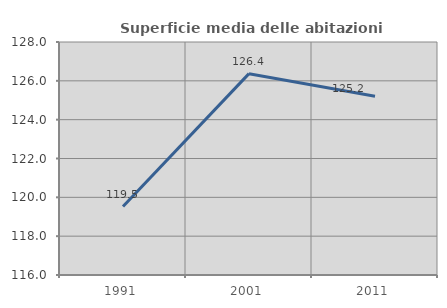
| Category | Superficie media delle abitazioni occupate |
|---|---|
| 1991.0 | 119.523 |
| 2001.0 | 126.37 |
| 2011.0 | 125.21 |